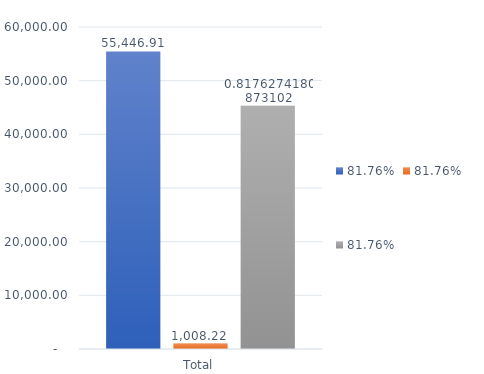
| Category | RESERVAS CONSTITUIDAS
 | CANCELACIONES RESERVAS PRESUPUESTALES
  | PAGOS
ACUMULADOS
 |
|---|---|---|---|
| Total | 55446.915 | 1008.219 | 45334.918 |